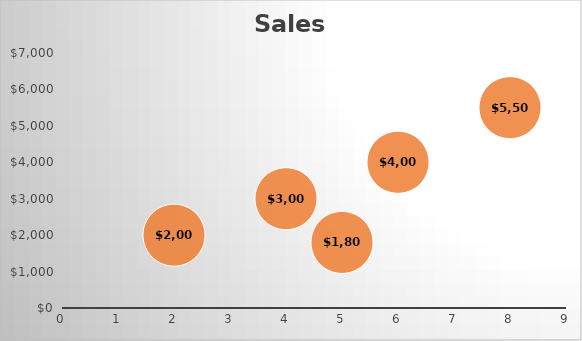
| Category | Quantity |
|---|---|
| 5.0 | 1800 |
| 4.0 | 3000 |
| 6.0 | 4000 |
| 8.0 | 5500 |
| 2.0 | 2000 |